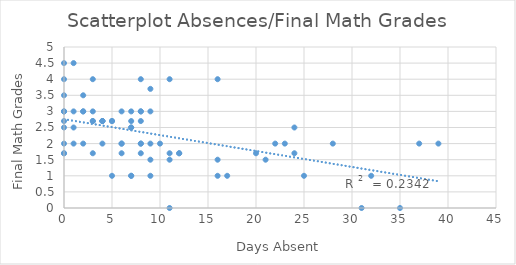
| Category | Final Math Grades |
|---|---|
| 0.0 | 2.7 |
| 28.0 | 2 |
| 32.0 | 1 |
| 7.0 | 1 |
| 11.0 | 4 |
| 20.0 | 1.7 |
| 2.0 | 2 |
| 6.0 | 2 |
| 0.0 | 3 |
| 0.0 | 1.7 |
| 7.0 | 2.5 |
| 37.0 | 2 |
| 16.0 | 1.5 |
| 16.0 | 4 |
| 23.0 | 2 |
| 39.0 | 2 |
| 0.0 | 4.5 |
| 8.0 | 3 |
| 7.0 | 2.7 |
| 3.0 | 2.7 |
| 4.0 | 2 |
| 21.0 | 1.5 |
| 5.0 | 2.7 |
| 1.0 | 4.5 |
| 2.0 | 3 |
| 10.0 | 2 |
| 2.0 | 3 |
| 2.0 | 3.5 |
| 0.0 | 2.5 |
| 35.0 | 0 |
| 8.0 | 3 |
| 0.0 | 3.5 |
| 5.0 | 1 |
| 25.0 | 1 |
| 3.0 | 2.7 |
| 4.0 | 2.7 |
| 8.0 | 2 |
| 12.0 | 1.7 |
| 11.0 | 1.5 |
| 17.0 | 1 |
| 4.0 | 2.7 |
| 12.0 | 1.7 |
| 24.0 | 2.5 |
| 16.0 | 1 |
| 8.0 | 4 |
| 1.0 | 2 |
| 24.0 | 1.7 |
| 7.0 | 2.5 |
| 7.0 | 3 |
| 8.0 | 2.7 |
| 0.0 | 2 |
| 9.0 | 1 |
| 22.0 | 2 |
| 1.0 | 3 |
| 11.0 | 1.7 |
| 8.0 | 2 |
| 6.0 | 1.7 |
| 9.0 | 1.5 |
| 11.0 | 0 |
| 9.0 | 3.7 |
| 0.0 | 4 |
| 6.0 | 3 |
| 7.0 | 1 |
| 3.0 | 3 |
| 4.0 | 2.7 |
| 6.0 | 2 |
| 0.0 | 1.7 |
| 3.0 | 1.7 |
| 3.0 | 4 |
| 9.0 | 2 |
| 1.0 | 2.5 |
| 9.0 | 3 |
| 4.0 | 2.7 |
| 8.0 | 1.7 |
| 31.0 | 0 |
| 0.0 | 3 |
| 0.0 | 3 |
| 5.0 | 2.7 |